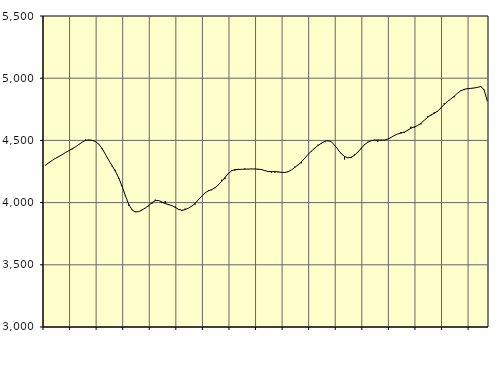
| Category | Piggar | Series 1 |
|---|---|---|
| nan | 4299.6 | 4302.85 |
| 87.0 | 4319.5 | 4320.87 |
| 87.0 | 4340.4 | 4339.79 |
| 87.0 | 4355.3 | 4356.32 |
| nan | 4371.7 | 4370.63 |
| 88.0 | 4384.7 | 4386.11 |
| 88.0 | 4402.2 | 4402.54 |
| 88.0 | 4418.8 | 4417.79 |
| nan | 4428.6 | 4432.63 |
| 89.0 | 4447.8 | 4448.62 |
| 89.0 | 4468.8 | 4467.32 |
| 89.0 | 4485 | 4485.98 |
| nan | 4507 | 4499.36 |
| 90.0 | 4500.9 | 4503.99 |
| 90.0 | 4499.3 | 4500.45 |
| 90.0 | 4489.2 | 4490.55 |
| nan | 4472.2 | 4469.86 |
| 91.0 | 4438.5 | 4434.47 |
| 91.0 | 4386.8 | 4387.93 |
| 91.0 | 4339.8 | 4340.25 |
| nan | 4290.2 | 4296.49 |
| 92.0 | 4263.4 | 4251.21 |
| 92.0 | 4193 | 4197.79 |
| 92.0 | 4137.7 | 4131.39 |
| nan | 4060.1 | 4056.12 |
| 93.0 | 3976.1 | 3987.63 |
| 93.0 | 3944.5 | 3941.72 |
| 93.0 | 3927.3 | 3924.56 |
| nan | 3926.6 | 3927.34 |
| 94.0 | 3942.6 | 3940.07 |
| 94.0 | 3954.9 | 3956.75 |
| 94.0 | 3970.7 | 3976.31 |
| nan | 3990.5 | 3998.85 |
| 95.0 | 4023.6 | 4015.35 |
| 95.0 | 4018.5 | 4016.52 |
| 95.0 | 3996.5 | 4004.92 |
| nan | 4012.7 | 3991.93 |
| 96.0 | 3979.8 | 3984.38 |
| 96.0 | 3975.7 | 3976.5 |
| 96.0 | 3969.1 | 3962.04 |
| nan | 3943.6 | 3946.07 |
| 97.0 | 3932.6 | 3938.09 |
| 97.0 | 3951.8 | 3943.47 |
| 97.0 | 3956.4 | 3955.57 |
| nan | 3973.9 | 3971.02 |
| 98.0 | 3983.9 | 3993.59 |
| 98.0 | 4028.5 | 4022.61 |
| 98.0 | 4051.2 | 4052.25 |
| nan | 4078 | 4078.07 |
| 99.0 | 4098.6 | 4093.96 |
| 99.0 | 4099.4 | 4104.6 |
| 99.0 | 4116.9 | 4119.55 |
| nan | 4140.5 | 4142.93 |
| 0.0 | 4184.4 | 4171.06 |
| 0.0 | 4188.1 | 4202.1 |
| 0.0 | 4236.5 | 4233.3 |
| nan | 4261.6 | 4255.85 |
| 1.0 | 4257.6 | 4265.09 |
| 1.0 | 4270.9 | 4266.54 |
| 1.0 | 4268.2 | 4267.8 |
| nan | 4274 | 4268.92 |
| 2.0 | 4267.7 | 4269.7 |
| 2.0 | 4272 | 4270.27 |
| 2.0 | 4270.6 | 4269.98 |
| nan | 4265.3 | 4268.73 |
| 3.0 | 4270.3 | 4265.29 |
| 3.0 | 4258.9 | 4257.48 |
| 3.0 | 4247.1 | 4250.19 |
| nan | 4241.9 | 4248.96 |
| 4.0 | 4240.8 | 4249.6 |
| 4.0 | 4244.2 | 4247.27 |
| 4.0 | 4240 | 4243 |
| nan | 4245.6 | 4242.08 |
| 5.0 | 4251.4 | 4248.45 |
| 5.0 | 4262.4 | 4262.85 |
| 5.0 | 4288.7 | 4281.87 |
| nan | 4304.6 | 4302.37 |
| 6.0 | 4316.1 | 4326.82 |
| 6.0 | 4358.1 | 4356.8 |
| 6.0 | 4385.7 | 4387.06 |
| nan | 4409.6 | 4413.5 |
| 7.0 | 4432.8 | 4437.39 |
| 7.0 | 4465.1 | 4458.77 |
| 7.0 | 4473.8 | 4477.18 |
| nan | 4493.4 | 4491.68 |
| 8.0 | 4494.3 | 4497.96 |
| 8.0 | 4488.8 | 4488.73 |
| 8.0 | 4462.5 | 4462.02 |
| nan | 4429.2 | 4427.72 |
| 9.0 | 4390.5 | 4393.7 |
| 9.0 | 4346.3 | 4370.13 |
| 9.0 | 4361.5 | 4360.32 |
| nan | 4358 | 4364.97 |
| 10.0 | 4386.9 | 4380.87 |
| 10.0 | 4402.3 | 4405.5 |
| 10.0 | 4430.6 | 4436.12 |
| nan | 4470.5 | 4465.42 |
| 11.0 | 4489 | 4486.14 |
| 11.0 | 4494.9 | 4497.08 |
| 11.0 | 4505.3 | 4502.24 |
| nan | 4489.7 | 4503.45 |
| 12.0 | 4504.6 | 4501.94 |
| 12.0 | 4500.2 | 4503.13 |
| 12.0 | 4509.6 | 4510.58 |
| nan | 4523.8 | 4523.43 |
| 13.0 | 4536.7 | 4539.27 |
| 13.0 | 4551.2 | 4551.53 |
| 13.0 | 4567 | 4558.57 |
| nan | 4561.9 | 4567.26 |
| 14.0 | 4576.8 | 4581.7 |
| 14.0 | 4610 | 4597.84 |
| 14.0 | 4602.6 | 4609.07 |
| nan | 4618.8 | 4618.96 |
| 15.0 | 4629 | 4636.76 |
| 15.0 | 4661.3 | 4661.68 |
| 15.0 | 4692.3 | 4685.59 |
| nan | 4699.4 | 4704.15 |
| 16.0 | 4726.4 | 4717.33 |
| 16.0 | 4729.6 | 4734.94 |
| 16.0 | 4757.3 | 4760.49 |
| nan | 4798.6 | 4788.91 |
| 17.0 | 4811.5 | 4813.09 |
| 17.0 | 4832.2 | 4832.62 |
| 17.0 | 4846.9 | 4854.74 |
| nan | 4879.1 | 4879.19 |
| 18.0 | 4900.4 | 4898.44 |
| 18.0 | 4904.5 | 4910.23 |
| 18.0 | 4918.9 | 4915.63 |
| nan | 4918.6 | 4918.06 |
| 19.0 | 4922.8 | 4921.06 |
| 19.0 | 4927.3 | 4925.87 |
| 19.0 | 4937.6 | 4932.86 |
| nan | 4904.8 | 4907.93 |
| 20.0 | 4815 | 4815.74 |